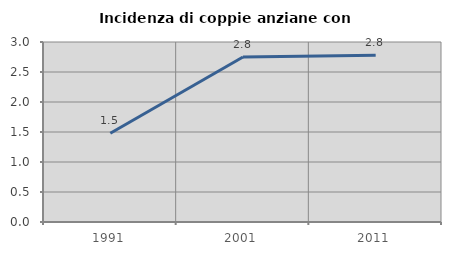
| Category | Incidenza di coppie anziane con figli |
|---|---|
| 1991.0 | 1.478 |
| 2001.0 | 2.75 |
| 2011.0 | 2.778 |